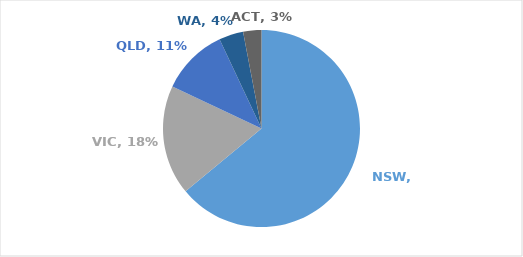
| Category | Series 0 |
|---|---|
| NSW | 0.64 |
| VIC | 0.18 |
| QLD | 0.11 |
| WA | 0.04 |
| ACT | 0.03 |